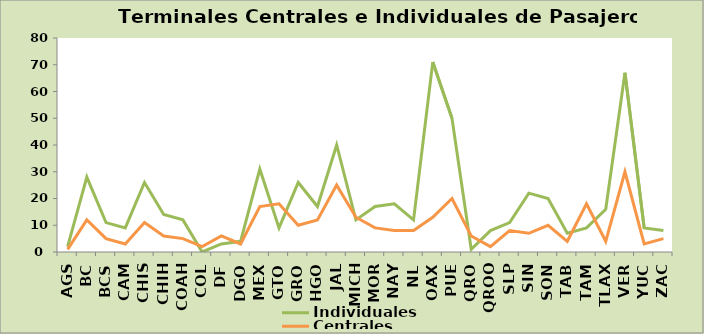
| Category | Individuales | Centrales |
|---|---|---|
| AGS | 2 | 1 |
| BC | 28 | 12 |
| BCS | 11 | 5 |
| CAM | 9 | 3 |
| CHIS | 26 | 11 |
| CHIH | 14 | 6 |
| COAH | 12 | 5 |
| COL | 0 | 2 |
| DF | 3 | 6 |
| DGO | 4 | 3 |
| MEX | 31 | 17 |
| GTO | 9 | 18 |
| GRO | 26 | 10 |
| HGO | 17 | 12 |
| JAL | 40 | 25 |
| MICH | 12 | 13 |
| MOR | 17 | 9 |
| NAY | 18 | 8 |
| NL | 12 | 8 |
| OAX | 71 | 13 |
| PUE | 50 | 20 |
| QRO | 1 | 6 |
| QROO | 8 | 2 |
| SLP | 11 | 8 |
| SIN | 22 | 7 |
| SON | 20 | 10 |
| TAB | 7 | 4 |
| TAM | 9 | 18 |
| TLAX | 16 | 4 |
| VER | 67 | 30 |
| YUC | 9 | 3 |
| ZAC | 8 | 5 |